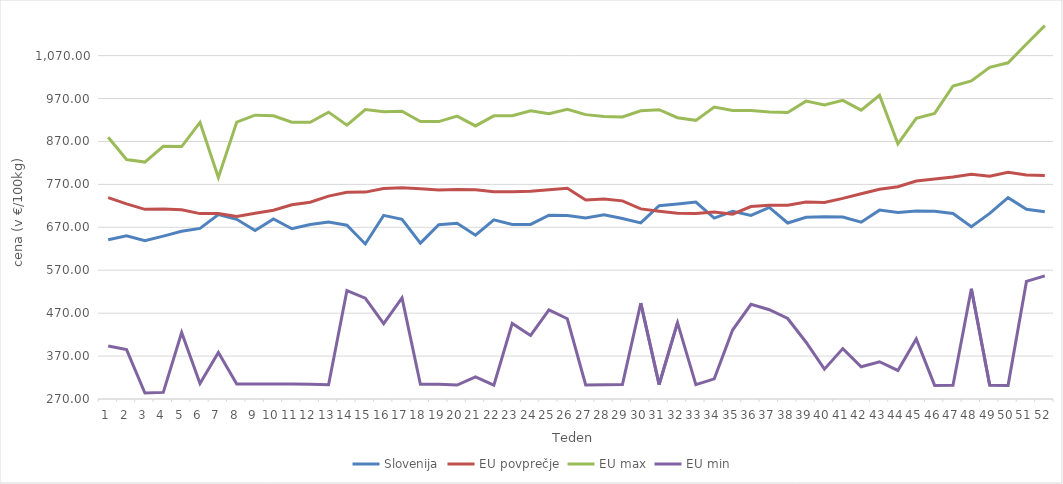
| Category | Slovenija | EU povprečje | EU max | EU min |
|---|---|---|---|---|
| 0 | 641.12 | 739.046 | 879.85 | 393.489 |
| 1 | 650.2 | 724.639 | 828 | 384.981 |
| 2 | 638.53 | 711.851 | 822 | 283.843 |
| 3 | 649.48 | 712.49 | 858.87 | 285.37 |
| 4 | 660.95 | 711.017 | 858.04 | 424.979 |
| 5 | 667.54 | 701.929 | 914.33 | 306.082 |
| 6 | 699.7 | 702.069 | 786 | 378.59 |
| 7 | 688.66 | 695.064 | 915.02 | 304.96 |
| 8 | 662.64 | 702.969 | 931.32 | 304.825 |
| 9 | 689.44 | 709.663 | 929.95 | 305.084 |
| 10 | 666.74 | 722.709 | 914.74 | 304.898 |
| 11 | 676.37 | 728.602 | 914.74 | 304.596 |
| 12 | 682.23 | 742.694 | 938.32 | 303.296 |
| 13 | 674.78 | 751.755 | 907.97 | 522.592 |
| 14 | 631.19 | 752.021 | 944.23 | 504.96 |
| 15 | 697.8 | 760.592 | 939.34 | 445.532 |
| 16 | 688.5 | 762.183 | 940.65 | 505.33 |
| 17 | 633.15 | 760.015 | 916.26 | 304.291 |
| 18 | 676.12 | 757.059 | 916.26 | 304.433 |
| 19 | 679.25 | 757.831 | 928.97 | 302.55 |
| 20 | 651.69 | 757.385 | 906.19 | 321.503 |
| 21 | 687.26 | 752.969 | 929.74 | 302.257 |
| 22 | 676.52 | 752.886 | 929.78 | 446.137 |
| 23 | 676.83 | 754.283 | 941.55 | 418.061 |
| 24 | 698.25 | 757.77 | 934.45 | 477.67 |
| 25 | 697.54 | 761.163 | 945.18 | 456.948 |
| 26 | 691.8 | 733.736 | 932.53 | 302.781 |
| 27 | 699 | 735.747 | 928.14 | 303.168 |
| 28 | 690.7 | 731.637 | 927.29 | 303.655 |
| 29 | 680.17 | 712.951 | 941.59 | 493.33 |
| 30 | 720.34 | 707.534 | 943.92 | 303.673 |
| 31 | 724.52 | 702.931 | 925.39 | 447.846 |
| 32 | 728.72 | 702.24 | 919.19 | 303.592 |
| 33 | 691.49 | 705.541 | 950.2 | 317.026 |
| 34 | 707.11 | 700.508 | 942.32 | 430.612 |
| 35 | 697.6 | 718.437 | 942.05 | 490.576 |
| 36 | 716.35 | 721.306 | 938.6 | 478.078 |
| 37 | 680.02 | 721.207 | 937.3 | 457.569 |
| 38 | 693.43 | 729.129 | 963.96 | 402.258 |
| 39 | 694.47 | 727.729 | 954.84 | 339.558 |
| 40 | 694.11 | 737.408 | 965.83 | 387.408 |
| 41 | 682 | 748.363 | 943.12 | 345.032 |
| 42 | 710.04 | 758.542 | 977.6 | 356.832 |
| 43 | 704.35 | 764.625 | 864.39 | 336.464 |
| 44 | 707.91 | 777.738 | 923.69 | 409.716 |
| 45 | 707.39 | 782.321 | 935.37 | 301.74 |
| 46 | 702.35 | 787.005 | 999.38 | 301.764 |
| 47 | 671.66 | 793.637 | 1011.06 | 526.665 |
| 48 | 702.38 | 789.208 | 1042.78 | 301.922 |
| 49 | 738.98 | 797.968 | 1053.28 | 301.731 |
| 50 | 712.07 | 791.989 | 1097.21 | 544.048 |
| 51 | 706.25 | 790.988 | 1139.81 | 556.809 |